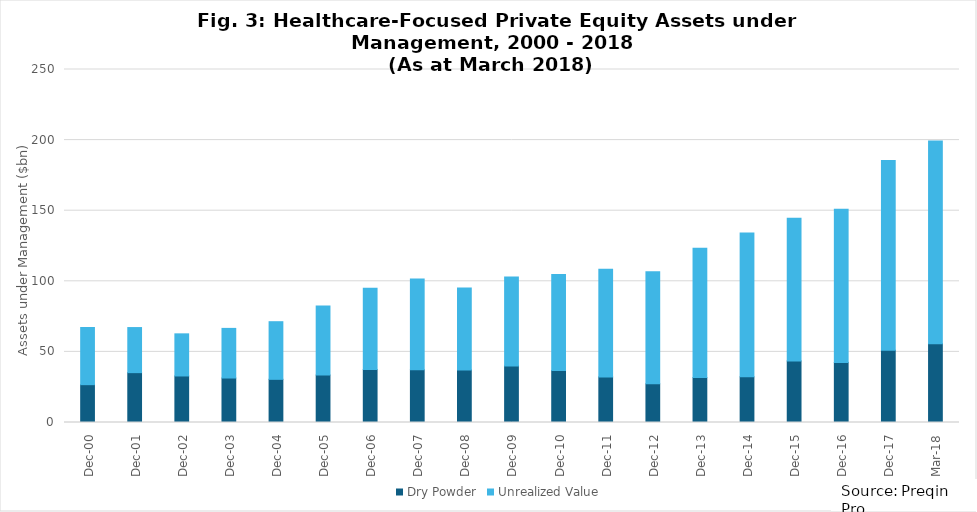
| Category | Dry Powder | Unrealized Value |
|---|---|---|
| 2000-12-31 | 26.79 | 40.5 |
| 2001-12-31 | 35.31 | 31.93 |
| 2002-12-31 | 32.95 | 29.84 |
| 2003-12-31 | 31.5 | 35.15 |
| 2004-12-31 | 30.57 | 40.82 |
| 2005-12-31 | 33.6 | 48.87 |
| 2006-12-31 | 37.47 | 57.61 |
| 2007-12-31 | 37.32 | 64.35 |
| 2008-12-31 | 37.19 | 58.1 |
| 2009-12-31 | 40.09 | 62.96 |
| 2010-12-31 | 36.79 | 68.04 |
| 2011-12-31 | 32.28 | 76.2 |
| 2012-12-31 | 27.36 | 79.47 |
| 2013-12-31 | 31.79 | 91.54 |
| 2014-12-31 | 32.34 | 101.86 |
| 2015-12-31 | 43.61 | 101.08 |
| 2016-12-31 | 42.57 | 108.48 |
| 2017-12-31 | 51.25 | 134.37 |
| 2018-03-31 | 55.8 | 143.57 |